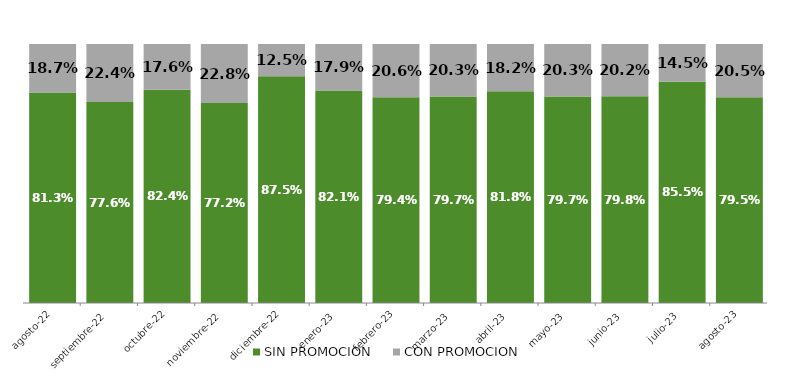
| Category | SIN PROMOCION   | CON PROMOCION   |
|---|---|---|
| 2022-08-01 | 0.813 | 0.187 |
| 2022-09-01 | 0.776 | 0.224 |
| 2022-10-01 | 0.824 | 0.176 |
| 2022-11-01 | 0.772 | 0.228 |
| 2022-12-01 | 0.875 | 0.125 |
| 2023-01-01 | 0.821 | 0.179 |
| 2023-02-01 | 0.794 | 0.206 |
| 2023-03-01 | 0.797 | 0.203 |
| 2023-04-01 | 0.818 | 0.182 |
| 2023-05-01 | 0.797 | 0.203 |
| 2023-06-01 | 0.798 | 0.202 |
| 2023-07-01 | 0.855 | 0.145 |
| 2023-08-01 | 0.795 | 0.205 |